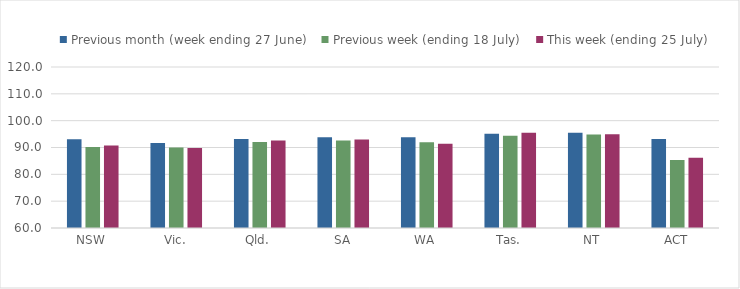
| Category | Previous month (week ending 27 June) | Previous week (ending 18 July) | This week (ending 25 July) |
|---|---|---|---|
| NSW | 93.087 | 90.215 | 90.704 |
| Vic. | 91.716 | 90.004 | 89.842 |
| Qld. | 93.151 | 92.064 | 92.614 |
| SA | 93.841 | 92.598 | 92.987 |
| WA | 93.863 | 91.991 | 91.382 |
| Tas. | 95.094 | 94.353 | 95.541 |
| NT | 95.509 | 94.852 | 94.962 |
| ACT | 93.139 | 85.307 | 86.221 |